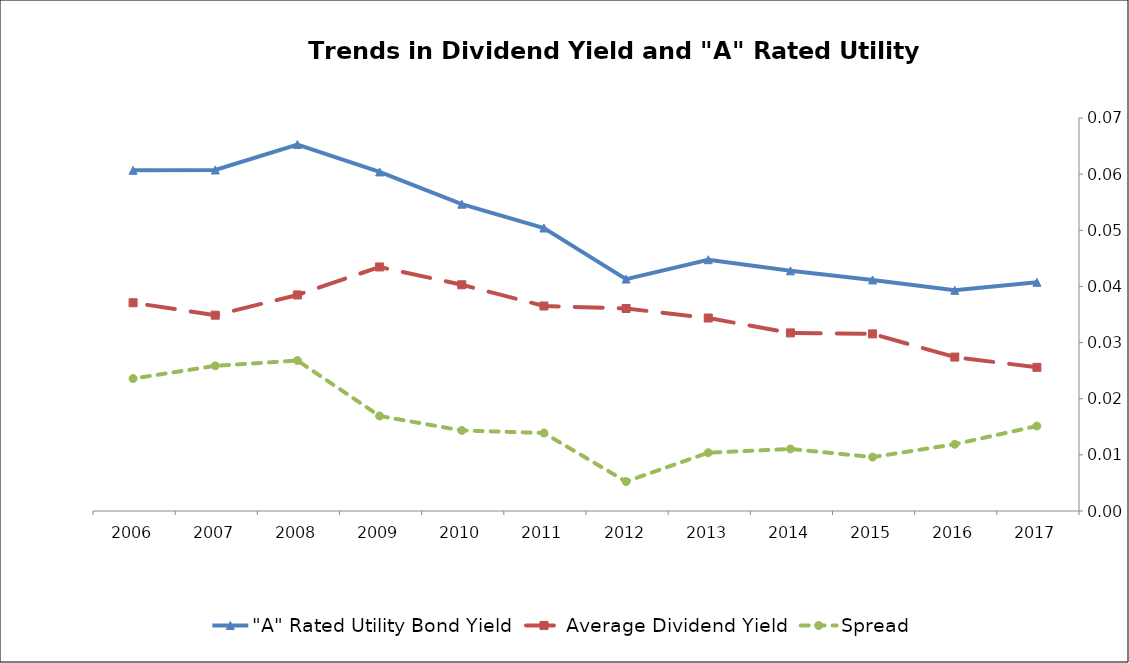
| Category | "A" Rated Utility Bond Yield | Average Dividend Yield | Spread |
|---|---|---|---|
| 2017.0 | 0.041 | 0.026 | 0.015 |
| 2016.0 | 0.039 | 0.027 | 0.012 |
| 2015.0 | 0.041 | 0.032 | 0.01 |
| 2014.0 | 0.043 | 0.032 | 0.011 |
| 2013.0 | 0.045 | 0.034 | 0.01 |
| 2012.0 | 0.041 | 0.036 | 0.005 |
| 2011.0 | 0.05 | 0.037 | 0.014 |
| 2010.0 | 0.055 | 0.04 | 0.014 |
| 2009.0 | 0.06 | 0.043 | 0.017 |
| 2008.0 | 0.065 | 0.038 | 0.027 |
| 2007.0 | 0.061 | 0.035 | 0.026 |
| 2006.0 | 0.061 | 0.037 | 0.024 |